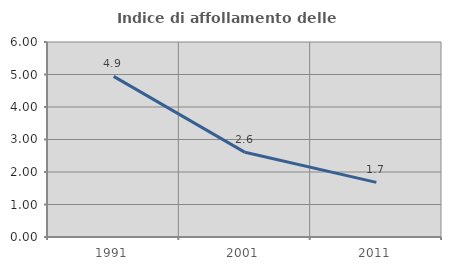
| Category | Indice di affollamento delle abitazioni  |
|---|---|
| 1991.0 | 4.943 |
| 2001.0 | 2.605 |
| 2011.0 | 1.681 |